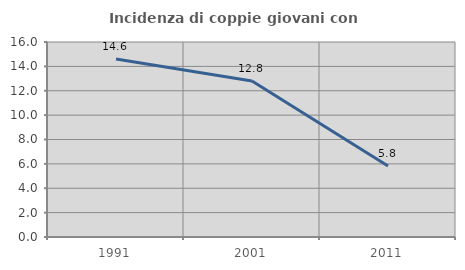
| Category | Incidenza di coppie giovani con figli |
|---|---|
| 1991.0 | 14.599 |
| 2001.0 | 12.805 |
| 2011.0 | 5.825 |